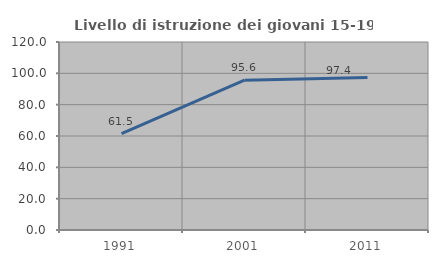
| Category | Livello di istruzione dei giovani 15-19 anni |
|---|---|
| 1991.0 | 61.527 |
| 2001.0 | 95.608 |
| 2011.0 | 97.357 |